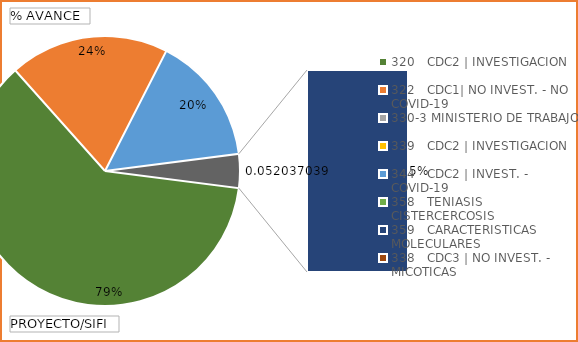
| Category | Total |
|---|---|
| 320   CDC2 | INVESTIGACION | 0.785 |
| 322   CDC1| NO INVEST. - NO COVID-19 | 0.244 |
| 330-3 MINISTERIO DE TRABAJO | 0 |
| 339   CDC2 | INVESTIGACION | 0 |
| 344   CDC2 | INVEST. - COVID-19 | 0.198 |
| 358   TENIASIS CISTERCERCOSIS | 0 |
| 359   CARACTERISTICAS MOLECULARES | 0.052 |
| 338   CDC3 | NO INVEST. - MICOTICAS | 0 |